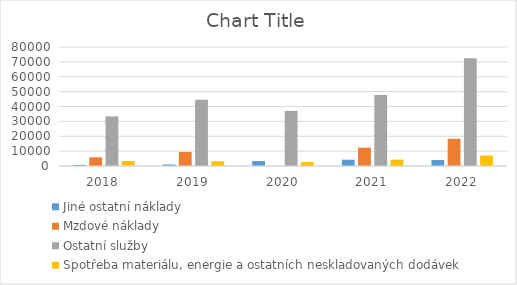
| Category | Jiné ostatní náklady | Mzdové náklady | Ostatní služby | Spotřeba materiálu, energie a ostatních neskladovaných dodávek |
|---|---|---|---|---|
| 2018.0 | 746 | 5856 | 33354 | 3363 |
| 2019.0 | 991 | 9399 | 44477 | 3144 |
| 2020.0 | 3315 | 0 | 37038 | 2657 |
| 2021.0 | 4222 | 12304 | 47685 | 4267 |
| 2022.0 | 4042 | 18337 | 72395 | 7065 |